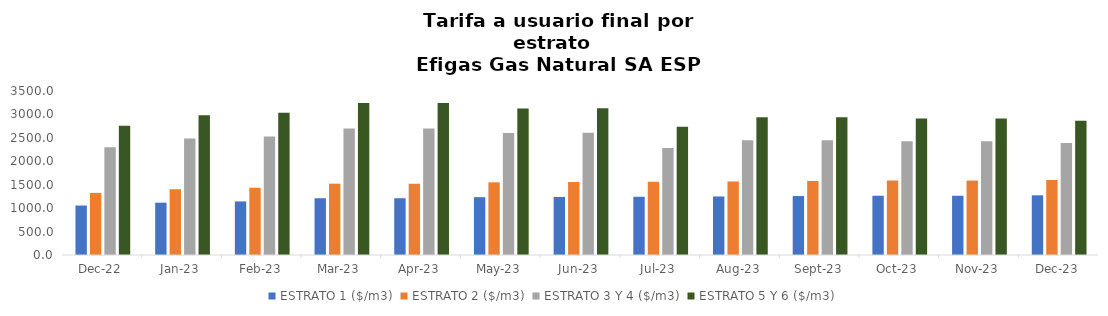
| Category | ESTRATO 1 ($/m3) | ESTRATO 2 ($/m3) | ESTRATO 3 Y 4 ($/m3) | ESTRATO 5 Y 6 ($/m3) |
|---|---|---|---|---|
| 2022-12-01 | 1056.14 | 1326.08 | 2297.18 | 2756.616 |
| 2023-01-01 | 1116.6 | 1402.33 | 2485 | 2982 |
| 2023-02-01 | 1143.48 | 1435.53 | 2531 | 3037.2 |
| 2023-03-01 | 1211.66 | 1522.37 | 2701.57 | 3241.884 |
| 2023-04-01 | 1211.66 | 1522.37 | 2701.57 | 3241.884 |
| 2023-05-01 | 1233.96 | 1550.39 | 2603.83 | 3124.596 |
| 2023-06-01 | 1239.35 | 1557.16 | 2610.15 | 3132.18 |
| 2023-07-01 | 1243.07 | 1561.83 | 2281.753 | 2738.104 |
| 2023-08-01 | 1249.3 | 1569.65 | 2451.116 | 2941.34 |
| 2023-09-01 | 1258.03 | 1580.63 | 2447.703 | 2937.244 |
| 2023-10-01 | 1264.72 | 1589.03 | 2427.174 | 2912.609 |
| 2023-11-01 | 1264.72 | 1589.03 | 2427.174 | 2912.609 |
| 2023-12-01 | 1273.83 | 1600.47 | 2388.722 | 2866.466 |